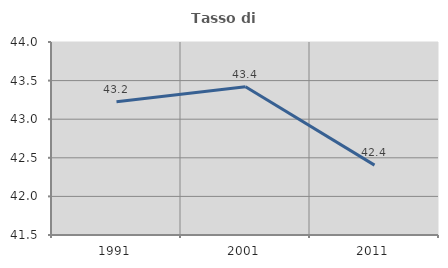
| Category | Tasso di occupazione   |
|---|---|
| 1991.0 | 43.226 |
| 2001.0 | 43.421 |
| 2011.0 | 42.405 |